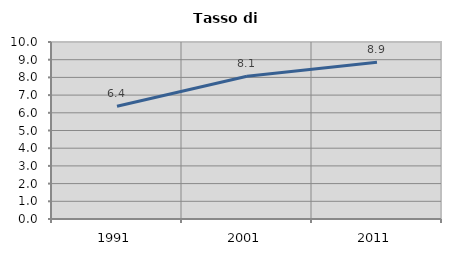
| Category | Tasso di disoccupazione   |
|---|---|
| 1991.0 | 6.367 |
| 2001.0 | 8.065 |
| 2011.0 | 8.861 |